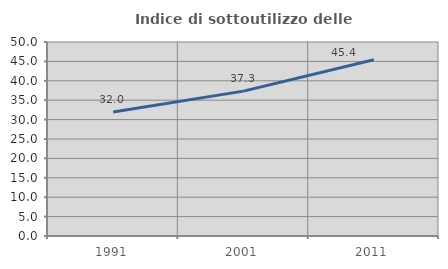
| Category | Indice di sottoutilizzo delle abitazioni  |
|---|---|
| 1991.0 | 31.98 |
| 2001.0 | 37.335 |
| 2011.0 | 45.42 |